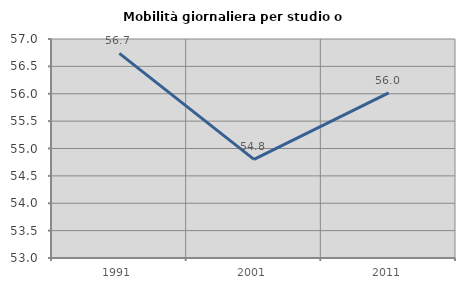
| Category | Mobilità giornaliera per studio o lavoro |
|---|---|
| 1991.0 | 56.739 |
| 2001.0 | 54.801 |
| 2011.0 | 56.018 |